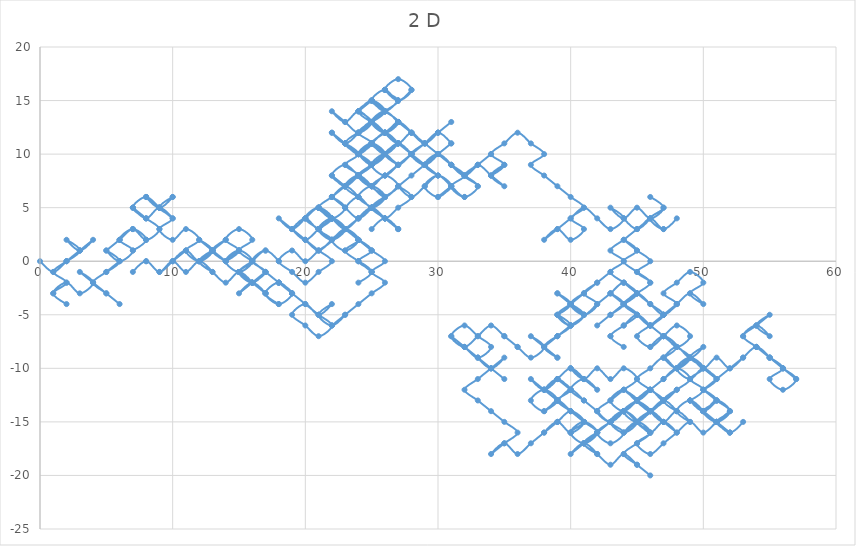
| Category | Series 0 |
|---|---|
| 0.0 | 0 |
| 1.0 | -1 |
| 2.0 | 0 |
| 3.0 | 1 |
| 4.0 | 2 |
| 3.0 | 1 |
| 2.0 | 2 |
| 3.0 | 1 |
| 2.0 | 0 |
| 3.0 | 1 |
| 2.0 | 0 |
| 1.0 | -1 |
| 2.0 | -2 |
| 1.0 | -3 |
| 2.0 | -4 |
| 1.0 | -3 |
| 2.0 | -2 |
| 3.0 | -3 |
| 4.0 | -2 |
| 3.0 | -1 |
| 4.0 | -2 |
| 5.0 | -3 |
| 6.0 | -4 |
| 5.0 | -3 |
| 4.0 | -2 |
| 5.0 | -1 |
| 6.0 | 0 |
| 5.0 | -1 |
| 6.0 | 0 |
| 5.0 | 1 |
| 6.0 | 0 |
| 7.0 | 1 |
| 6.0 | 2 |
| 7.0 | 3 |
| 8.0 | 2 |
| 7.0 | 1 |
| 8.0 | 2 |
| 7.0 | 3 |
| 6.0 | 2 |
| 5.0 | 1 |
| 6.0 | 2 |
| 7.0 | 3 |
| 8.0 | 2 |
| 9.0 | 3 |
| 8.0 | 4 |
| 7.0 | 5 |
| 8.0 | 6 |
| 9.0 | 5 |
| 10.0 | 4 |
| 9.0 | 5 |
| 8.0 | 4 |
| 7.0 | 5 |
| 8.0 | 4 |
| 7.0 | 5 |
| 8.0 | 6 |
| 9.0 | 5 |
| 10.0 | 6 |
| 9.0 | 5 |
| 8.0 | 6 |
| 9.0 | 5 |
| 10.0 | 6 |
| 9.0 | 5 |
| 10.0 | 4 |
| 9.0 | 3 |
| 10.0 | 2 |
| 11.0 | 3 |
| 12.0 | 2 |
| 11.0 | 1 |
| 12.0 | 0 |
| 13.0 | 1 |
| 12.0 | 0 |
| 13.0 | 1 |
| 12.0 | 0 |
| 13.0 | -1 |
| 12.0 | 0 |
| 11.0 | -1 |
| 10.0 | 0 |
| 9.0 | -1 |
| 8.0 | 0 |
| 7.0 | -1 |
| 8.0 | 0 |
| 9.0 | -1 |
| 10.0 | 0 |
| 11.0 | 1 |
| 10.0 | 0 |
| 11.0 | 1 |
| 12.0 | 0 |
| 13.0 | 1 |
| 12.0 | 2 |
| 13.0 | 1 |
| 14.0 | 0 |
| 13.0 | 1 |
| 14.0 | 2 |
| 13.0 | 1 |
| 12.0 | 0 |
| 13.0 | -1 |
| 14.0 | -2 |
| 15.0 | -1 |
| 16.0 | -2 |
| 15.0 | -1 |
| 16.0 | 0 |
| 17.0 | 1 |
| 18.0 | 0 |
| 17.0 | 1 |
| 16.0 | 0 |
| 17.0 | -1 |
| 16.0 | -2 |
| 17.0 | -1 |
| 16.0 | -2 |
| 15.0 | -3 |
| 16.0 | -2 |
| 17.0 | -3 |
| 16.0 | -2 |
| 15.0 | -1 |
| 16.0 | -2 |
| 17.0 | -1 |
| 16.0 | -2 |
| 15.0 | -1 |
| 16.0 | 0 |
| 15.0 | 1 |
| 14.0 | 0 |
| 15.0 | -1 |
| 16.0 | 0 |
| 15.0 | 1 |
| 14.0 | 0 |
| 15.0 | 1 |
| 14.0 | 0 |
| 15.0 | 1 |
| 14.0 | 2 |
| 15.0 | 3 |
| 16.0 | 2 |
| 15.0 | 1 |
| 16.0 | 0 |
| 17.0 | -1 |
| 18.0 | -2 |
| 19.0 | -3 |
| 18.0 | -2 |
| 17.0 | -3 |
| 18.0 | -4 |
| 17.0 | -3 |
| 18.0 | -2 |
| 19.0 | -3 |
| 18.0 | -2 |
| 17.0 | -3 |
| 18.0 | -4 |
| 19.0 | -3 |
| 18.0 | -2 |
| 19.0 | -3 |
| 20.0 | -4 |
| 21.0 | -5 |
| 22.0 | -6 |
| 21.0 | -7 |
| 20.0 | -6 |
| 19.0 | -5 |
| 20.0 | -4 |
| 21.0 | -5 |
| 22.0 | -4 |
| 21.0 | -5 |
| 22.0 | -6 |
| 23.0 | -5 |
| 22.0 | -6 |
| 23.0 | -5 |
| 24.0 | -4 |
| 25.0 | -3 |
| 26.0 | -2 |
| 25.0 | -1 |
| 26.0 | 0 |
| 25.0 | 1 |
| 24.0 | 2 |
| 23.0 | 3 |
| 22.0 | 4 |
| 23.0 | 3 |
| 22.0 | 4 |
| 21.0 | 5 |
| 22.0 | 4 |
| 21.0 | 5 |
| 20.0 | 4 |
| 19.0 | 3 |
| 18.0 | 4 |
| 19.0 | 3 |
| 20.0 | 2 |
| 21.0 | 1 |
| 22.0 | 2 |
| 23.0 | 3 |
| 24.0 | 2 |
| 23.0 | 1 |
| 22.0 | 2 |
| 23.0 | 3 |
| 22.0 | 4 |
| 23.0 | 3 |
| 22.0 | 4 |
| 21.0 | 3 |
| 22.0 | 2 |
| 21.0 | 1 |
| 20.0 | 0 |
| 19.0 | 1 |
| 18.0 | 0 |
| 19.0 | -1 |
| 20.0 | -2 |
| 21.0 | -1 |
| 22.0 | 0 |
| 21.0 | 1 |
| 20.0 | 2 |
| 19.0 | 3 |
| 20.0 | 2 |
| 21.0 | 3 |
| 22.0 | 4 |
| 21.0 | 5 |
| 20.0 | 4 |
| 21.0 | 3 |
| 22.0 | 2 |
| 23.0 | 3 |
| 24.0 | 4 |
| 25.0 | 5 |
| 24.0 | 4 |
| 23.0 | 5 |
| 22.0 | 6 |
| 23.0 | 5 |
| 22.0 | 4 |
| 21.0 | 5 |
| 22.0 | 4 |
| 23.0 | 3 |
| 24.0 | 2 |
| 23.0 | 3 |
| 24.0 | 2 |
| 23.0 | 1 |
| 24.0 | 0 |
| 25.0 | -1 |
| 24.0 | 0 |
| 25.0 | -1 |
| 24.0 | -2 |
| 25.0 | -1 |
| 24.0 | 0 |
| 25.0 | 1 |
| 24.0 | 2 |
| 25.0 | 1 |
| 24.0 | 2 |
| 23.0 | 3 |
| 24.0 | 2 |
| 23.0 | 3 |
| 22.0 | 4 |
| 21.0 | 3 |
| 20.0 | 4 |
| 19.0 | 3 |
| 20.0 | 4 |
| 21.0 | 3 |
| 22.0 | 4 |
| 23.0 | 3 |
| 22.0 | 2 |
| 21.0 | 3 |
| 22.0 | 4 |
| 21.0 | 5 |
| 22.0 | 6 |
| 23.0 | 7 |
| 24.0 | 6 |
| 23.0 | 7 |
| 24.0 | 8 |
| 23.0 | 7 |
| 22.0 | 6 |
| 21.0 | 5 |
| 22.0 | 4 |
| 23.0 | 3 |
| 24.0 | 4 |
| 25.0 | 5 |
| 26.0 | 4 |
| 27.0 | 3 |
| 26.0 | 4 |
| 25.0 | 5 |
| 26.0 | 6 |
| 25.0 | 7 |
| 26.0 | 8 |
| 27.0 | 9 |
| 28.0 | 10 |
| 27.0 | 9 |
| 26.0 | 8 |
| 25.0 | 9 |
| 26.0 | 10 |
| 27.0 | 9 |
| 28.0 | 10 |
| 29.0 | 11 |
| 30.0 | 12 |
| 31.0 | 13 |
| 30.0 | 12 |
| 29.0 | 11 |
| 28.0 | 12 |
| 27.0 | 11 |
| 26.0 | 12 |
| 27.0 | 11 |
| 26.0 | 12 |
| 25.0 | 11 |
| 24.0 | 10 |
| 25.0 | 11 |
| 24.0 | 12 |
| 25.0 | 13 |
| 24.0 | 12 |
| 25.0 | 13 |
| 26.0 | 12 |
| 27.0 | 11 |
| 28.0 | 10 |
| 29.0 | 9 |
| 30.0 | 8 |
| 29.0 | 9 |
| 30.0 | 10 |
| 31.0 | 9 |
| 30.0 | 10 |
| 29.0 | 9 |
| 28.0 | 10 |
| 29.0 | 11 |
| 30.0 | 12 |
| 31.0 | 11 |
| 30.0 | 12 |
| 29.0 | 11 |
| 28.0 | 12 |
| 27.0 | 13 |
| 26.0 | 14 |
| 25.0 | 13 |
| 26.0 | 12 |
| 27.0 | 13 |
| 28.0 | 12 |
| 27.0 | 13 |
| 26.0 | 14 |
| 25.0 | 13 |
| 26.0 | 14 |
| 25.0 | 15 |
| 26.0 | 14 |
| 27.0 | 15 |
| 26.0 | 14 |
| 25.0 | 15 |
| 26.0 | 14 |
| 27.0 | 13 |
| 26.0 | 12 |
| 25.0 | 13 |
| 24.0 | 12 |
| 25.0 | 13 |
| 24.0 | 14 |
| 25.0 | 13 |
| 24.0 | 12 |
| 23.0 | 13 |
| 22.0 | 14 |
| 23.0 | 13 |
| 24.0 | 14 |
| 25.0 | 13 |
| 24.0 | 14 |
| 25.0 | 15 |
| 24.0 | 14 |
| 25.0 | 15 |
| 26.0 | 14 |
| 25.0 | 13 |
| 26.0 | 12 |
| 27.0 | 13 |
| 26.0 | 14 |
| 25.0 | 15 |
| 26.0 | 16 |
| 27.0 | 15 |
| 28.0 | 16 |
| 27.0 | 15 |
| 26.0 | 16 |
| 27.0 | 15 |
| 26.0 | 16 |
| 27.0 | 15 |
| 28.0 | 16 |
| 27.0 | 17 |
| 26.0 | 16 |
| 27.0 | 15 |
| 26.0 | 14 |
| 25.0 | 13 |
| 26.0 | 14 |
| 25.0 | 13 |
| 26.0 | 12 |
| 27.0 | 11 |
| 28.0 | 10 |
| 29.0 | 9 |
| 30.0 | 10 |
| 31.0 | 11 |
| 30.0 | 10 |
| 29.0 | 9 |
| 30.0 | 10 |
| 29.0 | 9 |
| 28.0 | 10 |
| 27.0 | 11 |
| 26.0 | 10 |
| 27.0 | 11 |
| 28.0 | 10 |
| 27.0 | 11 |
| 26.0 | 10 |
| 25.0 | 11 |
| 26.0 | 10 |
| 25.0 | 11 |
| 26.0 | 10 |
| 25.0 | 9 |
| 24.0 | 8 |
| 25.0 | 7 |
| 24.0 | 8 |
| 23.0 | 7 |
| 22.0 | 6 |
| 23.0 | 7 |
| 24.0 | 8 |
| 23.0 | 7 |
| 24.0 | 8 |
| 25.0 | 9 |
| 24.0 | 10 |
| 25.0 | 11 |
| 26.0 | 10 |
| 27.0 | 11 |
| 26.0 | 10 |
| 25.0 | 9 |
| 24.0 | 8 |
| 25.0 | 7 |
| 24.0 | 8 |
| 23.0 | 7 |
| 24.0 | 6 |
| 23.0 | 7 |
| 24.0 | 8 |
| 23.0 | 9 |
| 24.0 | 10 |
| 23.0 | 11 |
| 24.0 | 10 |
| 25.0 | 11 |
| 24.0 | 10 |
| 25.0 | 9 |
| 24.0 | 8 |
| 25.0 | 7 |
| 26.0 | 8 |
| 27.0 | 7 |
| 26.0 | 6 |
| 25.0 | 5 |
| 24.0 | 6 |
| 23.0 | 5 |
| 24.0 | 6 |
| 25.0 | 5 |
| 26.0 | 6 |
| 25.0 | 7 |
| 24.0 | 6 |
| 25.0 | 5 |
| 26.0 | 4 |
| 27.0 | 3 |
| 26.0 | 4 |
| 25.0 | 3 |
| 26.0 | 4 |
| 27.0 | 3 |
| 26.0 | 4 |
| 25.0 | 5 |
| 26.0 | 6 |
| 25.0 | 5 |
| 26.0 | 6 |
| 25.0 | 5 |
| 24.0 | 4 |
| 25.0 | 5 |
| 26.0 | 4 |
| 27.0 | 5 |
| 28.0 | 6 |
| 27.0 | 7 |
| 28.0 | 6 |
| 29.0 | 7 |
| 30.0 | 8 |
| 31.0 | 7 |
| 30.0 | 6 |
| 31.0 | 7 |
| 30.0 | 6 |
| 29.0 | 7 |
| 30.0 | 8 |
| 31.0 | 7 |
| 32.0 | 6 |
| 33.0 | 7 |
| 32.0 | 8 |
| 33.0 | 9 |
| 34.0 | 10 |
| 33.0 | 9 |
| 32.0 | 8 |
| 31.0 | 9 |
| 30.0 | 10 |
| 29.0 | 9 |
| 28.0 | 8 |
| 27.0 | 7 |
| 26.0 | 6 |
| 25.0 | 7 |
| 24.0 | 8 |
| 23.0 | 9 |
| 22.0 | 8 |
| 23.0 | 7 |
| 22.0 | 8 |
| 23.0 | 7 |
| 24.0 | 8 |
| 25.0 | 9 |
| 24.0 | 10 |
| 25.0 | 9 |
| 26.0 | 10 |
| 25.0 | 11 |
| 24.0 | 10 |
| 23.0 | 11 |
| 22.0 | 12 |
| 23.0 | 11 |
| 24.0 | 10 |
| 23.0 | 11 |
| 24.0 | 10 |
| 23.0 | 11 |
| 24.0 | 12 |
| 23.0 | 11 |
| 22.0 | 12 |
| 23.0 | 11 |
| 24.0 | 10 |
| 25.0 | 11 |
| 26.0 | 10 |
| 27.0 | 11 |
| 26.0 | 10 |
| 27.0 | 9 |
| 26.0 | 10 |
| 25.0 | 11 |
| 26.0 | 12 |
| 27.0 | 13 |
| 26.0 | 12 |
| 25.0 | 13 |
| 26.0 | 14 |
| 27.0 | 13 |
| 28.0 | 12 |
| 29.0 | 11 |
| 30.0 | 10 |
| 31.0 | 9 |
| 32.0 | 8 |
| 31.0 | 7 |
| 32.0 | 6 |
| 33.0 | 7 |
| 32.0 | 8 |
| 31.0 | 9 |
| 32.0 | 8 |
| 33.0 | 9 |
| 34.0 | 8 |
| 35.0 | 7 |
| 34.0 | 8 |
| 35.0 | 9 |
| 34.0 | 8 |
| 35.0 | 9 |
| 34.0 | 10 |
| 35.0 | 11 |
| 36.0 | 12 |
| 37.0 | 11 |
| 38.0 | 10 |
| 37.0 | 9 |
| 38.0 | 8 |
| 39.0 | 7 |
| 40.0 | 6 |
| 41.0 | 5 |
| 40.0 | 4 |
| 41.0 | 3 |
| 40.0 | 2 |
| 39.0 | 3 |
| 38.0 | 2 |
| 39.0 | 3 |
| 40.0 | 4 |
| 41.0 | 5 |
| 42.0 | 4 |
| 43.0 | 3 |
| 44.0 | 4 |
| 43.0 | 5 |
| 44.0 | 4 |
| 45.0 | 5 |
| 46.0 | 4 |
| 47.0 | 5 |
| 46.0 | 6 |
| 47.0 | 5 |
| 46.0 | 4 |
| 47.0 | 3 |
| 48.0 | 4 |
| 47.0 | 3 |
| 46.0 | 4 |
| 45.0 | 3 |
| 44.0 | 4 |
| 45.0 | 3 |
| 46.0 | 4 |
| 45.0 | 3 |
| 44.0 | 2 |
| 43.0 | 1 |
| 44.0 | 0 |
| 43.0 | -1 |
| 44.0 | -2 |
| 45.0 | -3 |
| 44.0 | -2 |
| 45.0 | -3 |
| 44.0 | -4 |
| 45.0 | -3 |
| 44.0 | -4 |
| 45.0 | -3 |
| 46.0 | -2 |
| 45.0 | -1 |
| 44.0 | 0 |
| 45.0 | 1 |
| 44.0 | 2 |
| 45.0 | 1 |
| 46.0 | 0 |
| 45.0 | -1 |
| 46.0 | -2 |
| 45.0 | -3 |
| 44.0 | -4 |
| 45.0 | -5 |
| 46.0 | -6 |
| 45.0 | -5 |
| 44.0 | -4 |
| 43.0 | -3 |
| 44.0 | -4 |
| 45.0 | -5 |
| 46.0 | -6 |
| 47.0 | -5 |
| 48.0 | -4 |
| 47.0 | -3 |
| 48.0 | -2 |
| 49.0 | -1 |
| 50.0 | -2 |
| 49.0 | -3 |
| 50.0 | -4 |
| 49.0 | -3 |
| 48.0 | -4 |
| 47.0 | -5 |
| 48.0 | -4 |
| 47.0 | -5 |
| 48.0 | -4 |
| 47.0 | -5 |
| 46.0 | -4 |
| 45.0 | -3 |
| 44.0 | -2 |
| 43.0 | -3 |
| 42.0 | -4 |
| 41.0 | -5 |
| 40.0 | -4 |
| 41.0 | -3 |
| 42.0 | -2 |
| 43.0 | -1 |
| 42.0 | -2 |
| 41.0 | -3 |
| 42.0 | -4 |
| 41.0 | -5 |
| 40.0 | -4 |
| 41.0 | -5 |
| 40.0 | -6 |
| 39.0 | -5 |
| 40.0 | -4 |
| 41.0 | -3 |
| 40.0 | -4 |
| 41.0 | -5 |
| 40.0 | -6 |
| 39.0 | -7 |
| 40.0 | -6 |
| 41.0 | -5 |
| 40.0 | -4 |
| 39.0 | -3 |
| 40.0 | -4 |
| 39.0 | -5 |
| 40.0 | -4 |
| 39.0 | -3 |
| 40.0 | -4 |
| 41.0 | -5 |
| 40.0 | -6 |
| 39.0 | -5 |
| 40.0 | -6 |
| 39.0 | -7 |
| 38.0 | -8 |
| 39.0 | -7 |
| 38.0 | -8 |
| 39.0 | -9 |
| 38.0 | -8 |
| 39.0 | -9 |
| 38.0 | -8 |
| 37.0 | -7 |
| 38.0 | -8 |
| 37.0 | -9 |
| 36.0 | -8 |
| 35.0 | -7 |
| 36.0 | -8 |
| 35.0 | -7 |
| 34.0 | -6 |
| 33.0 | -7 |
| 32.0 | -8 |
| 31.0 | -7 |
| 32.0 | -6 |
| 33.0 | -7 |
| 34.0 | -8 |
| 33.0 | -9 |
| 32.0 | -8 |
| 31.0 | -7 |
| 32.0 | -8 |
| 33.0 | -9 |
| 34.0 | -10 |
| 35.0 | -11 |
| 34.0 | -10 |
| 33.0 | -9 |
| 34.0 | -10 |
| 35.0 | -9 |
| 34.0 | -10 |
| 33.0 | -11 |
| 32.0 | -12 |
| 33.0 | -13 |
| 34.0 | -14 |
| 35.0 | -15 |
| 36.0 | -16 |
| 35.0 | -17 |
| 34.0 | -18 |
| 35.0 | -17 |
| 36.0 | -18 |
| 37.0 | -17 |
| 38.0 | -16 |
| 39.0 | -15 |
| 40.0 | -16 |
| 41.0 | -15 |
| 40.0 | -14 |
| 39.0 | -13 |
| 38.0 | -14 |
| 37.0 | -13 |
| 38.0 | -12 |
| 39.0 | -13 |
| 38.0 | -14 |
| 39.0 | -13 |
| 40.0 | -12 |
| 41.0 | -13 |
| 42.0 | -14 |
| 41.0 | -13 |
| 40.0 | -12 |
| 41.0 | -11 |
| 42.0 | -12 |
| 41.0 | -11 |
| 40.0 | -10 |
| 39.0 | -11 |
| 38.0 | -12 |
| 39.0 | -11 |
| 40.0 | -10 |
| 41.0 | -11 |
| 40.0 | -10 |
| 41.0 | -11 |
| 42.0 | -10 |
| 43.0 | -11 |
| 44.0 | -10 |
| 45.0 | -11 |
| 44.0 | -12 |
| 43.0 | -13 |
| 42.0 | -14 |
| 43.0 | -15 |
| 44.0 | -14 |
| 43.0 | -15 |
| 42.0 | -16 |
| 41.0 | -17 |
| 42.0 | -16 |
| 41.0 | -15 |
| 40.0 | -16 |
| 41.0 | -17 |
| 42.0 | -16 |
| 41.0 | -15 |
| 40.0 | -14 |
| 39.0 | -13 |
| 38.0 | -12 |
| 39.0 | -13 |
| 38.0 | -12 |
| 37.0 | -11 |
| 38.0 | -12 |
| 39.0 | -11 |
| 38.0 | -12 |
| 39.0 | -11 |
| 40.0 | -12 |
| 39.0 | -11 |
| 40.0 | -12 |
| 39.0 | -13 |
| 40.0 | -14 |
| 41.0 | -15 |
| 40.0 | -16 |
| 39.0 | -15 |
| 38.0 | -16 |
| 39.0 | -15 |
| 40.0 | -14 |
| 41.0 | -15 |
| 40.0 | -16 |
| 41.0 | -17 |
| 42.0 | -16 |
| 41.0 | -17 |
| 40.0 | -18 |
| 41.0 | -17 |
| 42.0 | -18 |
| 41.0 | -17 |
| 42.0 | -16 |
| 41.0 | -17 |
| 42.0 | -18 |
| 43.0 | -19 |
| 44.0 | -18 |
| 45.0 | -19 |
| 46.0 | -20 |
| 45.0 | -19 |
| 44.0 | -18 |
| 45.0 | -17 |
| 46.0 | -16 |
| 45.0 | -15 |
| 44.0 | -16 |
| 45.0 | -15 |
| 46.0 | -14 |
| 45.0 | -13 |
| 46.0 | -14 |
| 47.0 | -13 |
| 48.0 | -12 |
| 47.0 | -13 |
| 48.0 | -14 |
| 47.0 | -13 |
| 46.0 | -14 |
| 45.0 | -15 |
| 46.0 | -16 |
| 45.0 | -17 |
| 46.0 | -18 |
| 47.0 | -17 |
| 48.0 | -16 |
| 49.0 | -15 |
| 50.0 | -16 |
| 51.0 | -15 |
| 52.0 | -14 |
| 51.0 | -15 |
| 50.0 | -14 |
| 51.0 | -13 |
| 50.0 | -12 |
| 51.0 | -13 |
| 52.0 | -14 |
| 51.0 | -15 |
| 52.0 | -16 |
| 51.0 | -15 |
| 52.0 | -16 |
| 53.0 | -15 |
| 52.0 | -16 |
| 51.0 | -15 |
| 50.0 | -14 |
| 49.0 | -13 |
| 50.0 | -14 |
| 51.0 | -13 |
| 50.0 | -14 |
| 49.0 | -13 |
| 50.0 | -14 |
| 51.0 | -13 |
| 52.0 | -14 |
| 51.0 | -15 |
| 50.0 | -14 |
| 51.0 | -15 |
| 50.0 | -14 |
| 49.0 | -13 |
| 50.0 | -14 |
| 49.0 | -13 |
| 48.0 | -14 |
| 49.0 | -15 |
| 48.0 | -14 |
| 47.0 | -15 |
| 46.0 | -14 |
| 47.0 | -15 |
| 46.0 | -14 |
| 45.0 | -15 |
| 44.0 | -14 |
| 45.0 | -13 |
| 44.0 | -12 |
| 45.0 | -13 |
| 46.0 | -14 |
| 45.0 | -13 |
| 46.0 | -12 |
| 47.0 | -11 |
| 48.0 | -10 |
| 49.0 | -11 |
| 48.0 | -12 |
| 47.0 | -13 |
| 46.0 | -12 |
| 45.0 | -13 |
| 46.0 | -12 |
| 45.0 | -13 |
| 44.0 | -14 |
| 43.0 | -15 |
| 42.0 | -14 |
| 43.0 | -15 |
| 44.0 | -14 |
| 43.0 | -15 |
| 42.0 | -16 |
| 43.0 | -17 |
| 44.0 | -16 |
| 43.0 | -15 |
| 44.0 | -14 |
| 45.0 | -15 |
| 44.0 | -16 |
| 43.0 | -15 |
| 44.0 | -14 |
| 43.0 | -15 |
| 44.0 | -14 |
| 43.0 | -15 |
| 44.0 | -14 |
| 45.0 | -15 |
| 46.0 | -16 |
| 47.0 | -15 |
| 48.0 | -16 |
| 47.0 | -15 |
| 46.0 | -14 |
| 45.0 | -13 |
| 46.0 | -12 |
| 45.0 | -13 |
| 44.0 | -12 |
| 43.0 | -13 |
| 44.0 | -14 |
| 45.0 | -13 |
| 46.0 | -12 |
| 47.0 | -11 |
| 48.0 | -10 |
| 49.0 | -9 |
| 48.0 | -10 |
| 47.0 | -9 |
| 48.0 | -10 |
| 49.0 | -9 |
| 50.0 | -10 |
| 51.0 | -9 |
| 52.0 | -10 |
| 53.0 | -9 |
| 54.0 | -8 |
| 55.0 | -9 |
| 56.0 | -10 |
| 57.0 | -11 |
| 56.0 | -10 |
| 55.0 | -9 |
| 56.0 | -10 |
| 55.0 | -11 |
| 56.0 | -12 |
| 57.0 | -11 |
| 56.0 | -10 |
| 55.0 | -9 |
| 54.0 | -8 |
| 53.0 | -7 |
| 54.0 | -6 |
| 55.0 | -5 |
| 54.0 | -6 |
| 55.0 | -7 |
| 54.0 | -6 |
| 53.0 | -7 |
| 54.0 | -8 |
| 55.0 | -9 |
| 54.0 | -8 |
| 53.0 | -9 |
| 52.0 | -10 |
| 51.0 | -11 |
| 50.0 | -12 |
| 51.0 | -11 |
| 50.0 | -10 |
| 51.0 | -11 |
| 50.0 | -10 |
| 49.0 | -11 |
| 48.0 | -10 |
| 49.0 | -9 |
| 50.0 | -10 |
| 49.0 | -11 |
| 50.0 | -12 |
| 49.0 | -13 |
| 50.0 | -12 |
| 49.0 | -11 |
| 50.0 | -10 |
| 49.0 | -9 |
| 50.0 | -8 |
| 49.0 | -9 |
| 48.0 | -8 |
| 47.0 | -9 |
| 48.0 | -8 |
| 47.0 | -7 |
| 46.0 | -8 |
| 47.0 | -7 |
| 48.0 | -8 |
| 49.0 | -7 |
| 48.0 | -6 |
| 47.0 | -7 |
| 46.0 | -8 |
| 45.0 | -7 |
| 46.0 | -6 |
| 47.0 | -5 |
| 46.0 | -6 |
| 47.0 | -5 |
| 46.0 | -4 |
| 45.0 | -3 |
| 44.0 | -4 |
| 43.0 | -5 |
| 42.0 | -6 |
| 43.0 | -5 |
| 44.0 | -4 |
| 43.0 | -3 |
| 44.0 | -4 |
| 45.0 | -5 |
| 44.0 | -6 |
| 43.0 | -7 |
| 44.0 | -8 |
| 43.0 | -7 |
| 44.0 | -6 |
| 45.0 | -5 |
| 46.0 | -6 |
| 47.0 | -7 |
| 46.0 | -6 |
| 47.0 | -7 |
| 48.0 | -8 |
| 49.0 | -9 |
| 48.0 | -10 |
| 47.0 | -9 |
| 46.0 | -10 |
| 45.0 | -11 |
| 46.0 | -12 |
| 47.0 | -13 |
| 46.0 | -14 |
| 45.0 | -15 |
| 44.0 | -14 |
| 45.0 | -13 |
| 44.0 | -14 |
| 45.0 | -15 |
| 46.0 | -14 |
| 45.0 | -15 |
| 46.0 | -16 |